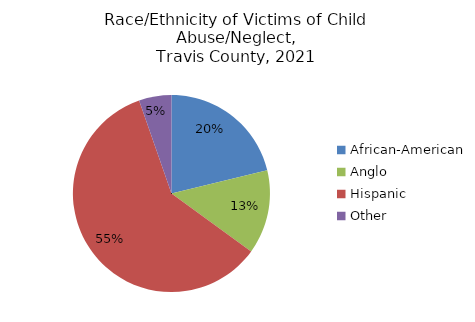
| Category | Series 0 |
|---|---|
| African-American | 0.196 |
| Anglo | 0.127 |
| Hispanic | 0.55 |
| Other | 0.049 |